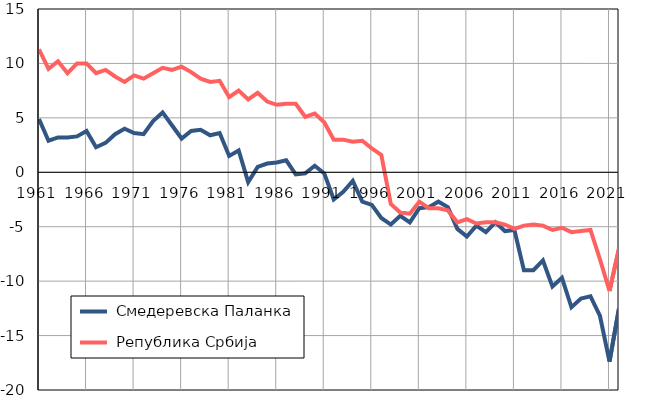
| Category |  Смедеревска Паланка |  Република Србија |
|---|---|---|
| 1961.0 | 4.9 | 11.3 |
| 1962.0 | 2.9 | 9.5 |
| 1963.0 | 3.2 | 10.2 |
| 1964.0 | 3.2 | 9.1 |
| 1965.0 | 3.3 | 10 |
| 1966.0 | 3.8 | 10 |
| 1967.0 | 2.3 | 9.1 |
| 1968.0 | 2.7 | 9.4 |
| 1969.0 | 3.5 | 8.8 |
| 1970.0 | 4 | 8.3 |
| 1971.0 | 3.6 | 8.9 |
| 1972.0 | 3.5 | 8.6 |
| 1973.0 | 4.7 | 9.1 |
| 1974.0 | 5.5 | 9.6 |
| 1975.0 | 4.3 | 9.4 |
| 1976.0 | 3.1 | 9.7 |
| 1977.0 | 3.8 | 9.2 |
| 1978.0 | 3.9 | 8.6 |
| 1979.0 | 3.4 | 8.3 |
| 1980.0 | 3.6 | 8.4 |
| 1981.0 | 1.5 | 6.9 |
| 1982.0 | 2 | 7.5 |
| 1983.0 | -0.9 | 6.7 |
| 1984.0 | 0.5 | 7.3 |
| 1985.0 | 0.8 | 6.5 |
| 1986.0 | 0.9 | 6.2 |
| 1987.0 | 1.1 | 6.3 |
| 1988.0 | -0.2 | 6.3 |
| 1989.0 | -0.1 | 5.1 |
| 1990.0 | 0.6 | 5.4 |
| 1991.0 | -0.1 | 4.6 |
| 1992.0 | -2.5 | 3 |
| 1993.0 | -1.8 | 3 |
| 1994.0 | -0.8 | 2.8 |
| 1995.0 | -2.7 | 2.9 |
| 1996.0 | -3 | 2.2 |
| 1997.0 | -4.2 | 1.6 |
| 1998.0 | -4.8 | -2.9 |
| 1999.0 | -4 | -3.7 |
| 2000.0 | -4.6 | -3.8 |
| 2001.0 | -3.3 | -2.7 |
| 2002.0 | -3.2 | -3.3 |
| 2003.0 | -2.7 | -3.3 |
| 2004.0 | -3.2 | -3.5 |
| 2005.0 | -5.2 | -4.6 |
| 2006.0 | -5.9 | -4.3 |
| 2007.0 | -4.9 | -4.7 |
| 2008.0 | -5.5 | -4.6 |
| 2009.0 | -4.6 | -4.6 |
| 2010.0 | -5.4 | -4.8 |
| 2011.0 | -5.3 | -5.2 |
| 2012.0 | -9 | -4.9 |
| 2013.0 | -9 | -4.8 |
| 2014.0 | -8.1 | -4.9 |
| 2015.0 | -10.5 | -5.3 |
| 2016.0 | -9.7 | -5.1 |
| 2017.0 | -12.4 | -5.5 |
| 2018.0 | -11.6 | -5.4 |
| 2019.0 | -11.4 | -5.3 |
| 2020.0 | -13.2 | -8 |
| 2021.0 | -17.4 | -10.9 |
| 2022.0 | -12.5 | -7 |